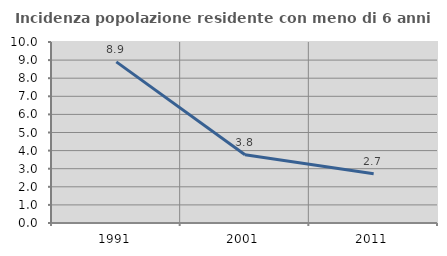
| Category | Incidenza popolazione residente con meno di 6 anni |
|---|---|
| 1991.0 | 8.901 |
| 2001.0 | 3.77 |
| 2011.0 | 2.722 |